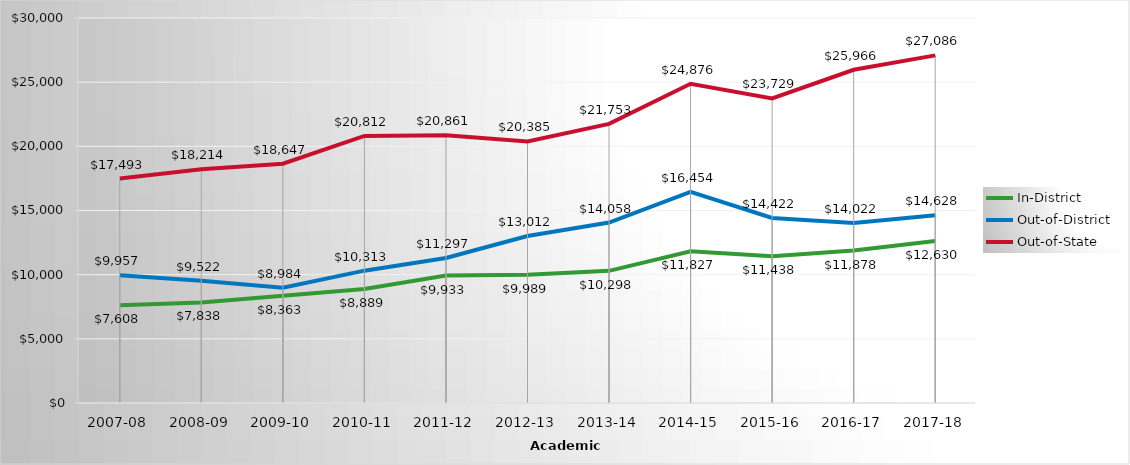
| Category | In-District | Out-of-District | Out-of-State |
|---|---|---|---|
| 2007-08 | 7608 | 9957 | 17493 |
| 2008-09 | 7838.053 | 9522.053 | 18213.684 |
| 2009-10 | 8363 | 8984 | 18647 |
| 2010-11 | 8889 | 10313 | 20812 |
| 2011-12 | 9933.23 | 11297.18 | 20861.23 |
| 2012-13 | 9988.67 | 13011.78 | 20384.67 |
| 2013-14 | 10297.84 | 14057.56 | 21753.28 |
| 2014-15 | 11827.062 | 16453.562 | 24875.688 |
| 2015-16 | 11438 | 14422 | 23729 |
| 2016-17 | 11878 | 14022 | 25966 |
| 2017-18 | 12630 | 14628 | 27086 |